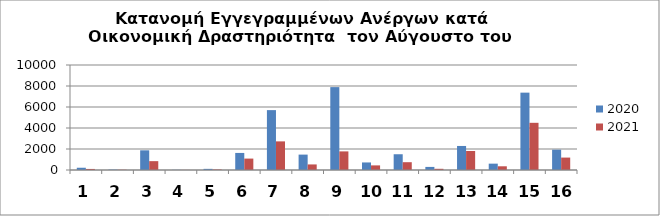
| Category | 2020 | 2021 |
|---|---|---|
| 0 | 215 | 101 |
| 1 | 38 | 26 |
| 2 | 1874 | 843 |
| 3 | 15 | 8 |
| 4 | 109 | 51 |
| 5 | 1625 | 1087 |
| 6 | 5703 | 2726 |
| 7 | 1466 | 530 |
| 8 | 7894 | 1772 |
| 9 | 719 | 439 |
| 10 | 1501 | 743 |
| 11 | 294 | 114 |
| 12 | 2289 | 1811 |
| 13 | 605 | 353 |
| 14 | 7367 | 4494 |
| 15 | 1935 | 1183 |